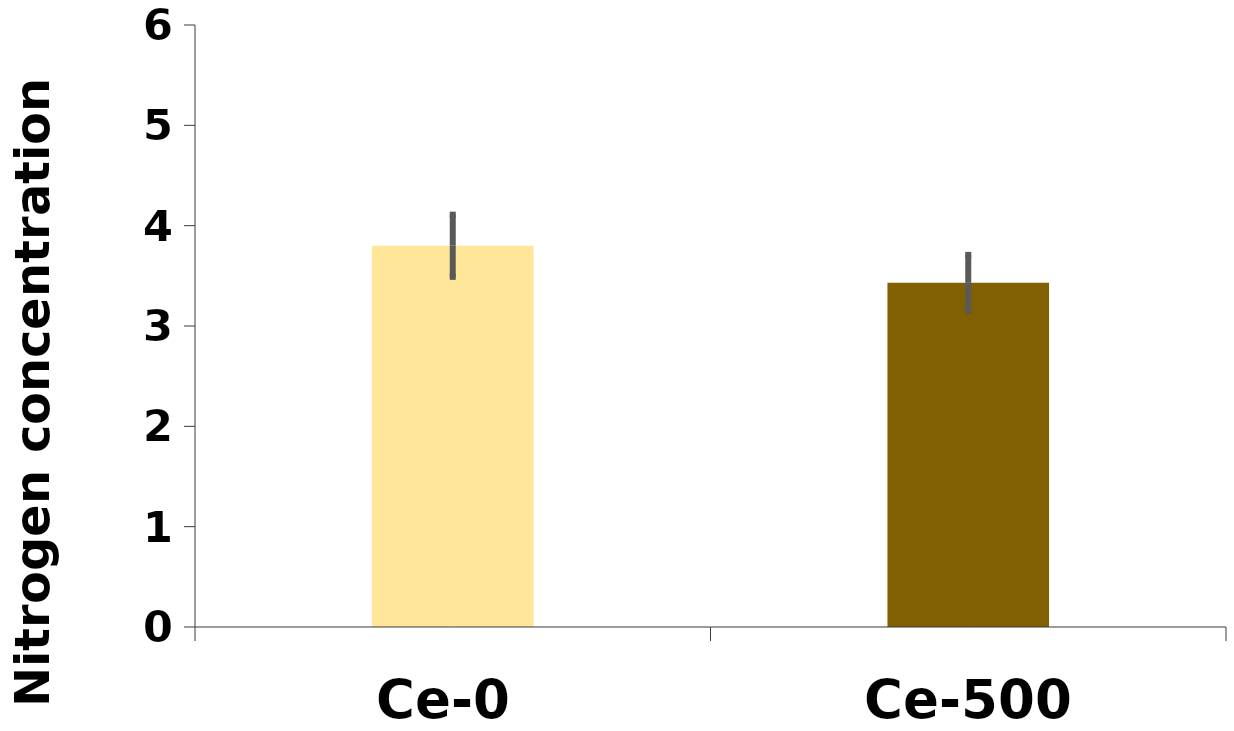
| Category | %N |
|---|---|
| Ce-0 | 3.8 |
| Ce-500 | 3.431 |